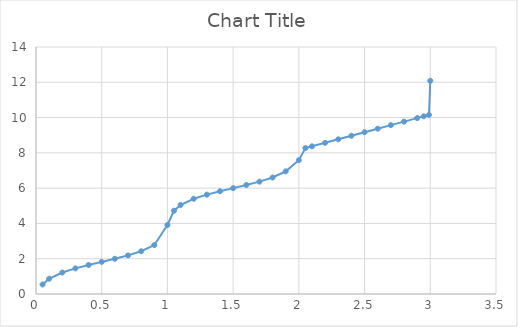
| Category | Series 0 |
|---|---|
| 0.05 | 0.541 |
| 0.1 | 0.866 |
| 0.2 | 1.218 |
| 0.3 | 1.452 |
| 0.4 | 1.644 |
| 0.5 | 1.82 |
| 0.6 | 1.996 |
| 0.7 | 2.188 |
| 0.8 | 2.422 |
| 0.9 | 2.774 |
| 1.0 | 3.91 |
| 1.05 | 4.721 |
| 1.1 | 5.046 |
| 1.2 | 5.398 |
| 1.3 | 5.632 |
| 1.4 | 5.824 |
| 1.5 | 6 |
| 1.6 | 6.176 |
| 1.7 | 6.368 |
| 1.8 | 6.602 |
| 1.9 | 6.954 |
| 2.0 | 7.585 |
| 2.05 | 8.27 |
| 2.1 | 8.37 |
| 2.2 | 8.57 |
| 2.3 | 8.77 |
| 2.4 | 8.97 |
| 2.5 | 9.17 |
| 2.6 | 9.37 |
| 2.7 | 9.57 |
| 2.8 | 9.77 |
| 2.9 | 9.97 |
| 2.95 | 10.07 |
| 2.99 | 10.15 |
| 3.0 | 12.085 |